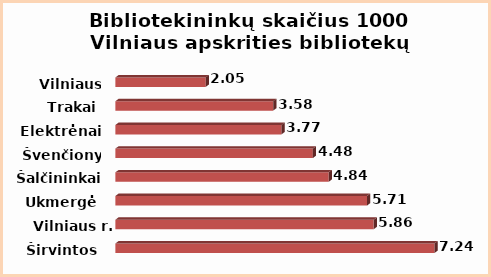
| Category | Series 0 |
|---|---|
| Širvintos | 7.24 |
| Vilniaus r. | 5.86 |
| Ukmergė | 5.71 |
| Šalčininkai | 4.84 |
| Švenčionys | 4.48 |
| Elektrėnai | 3.77 |
| Trakai | 3.58 |
| Vilniaus m. | 2.05 |